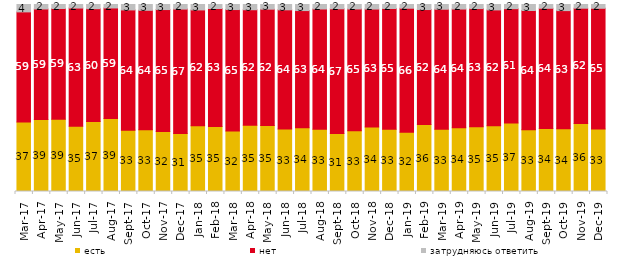
| Category | есть | нет | затрудняюсь ответить |
|---|---|---|---|
| 2017-03-01 | 37.2 | 58.85 | 3.95 |
| 2017-04-01 | 38.5 | 59.1 | 2.4 |
| 2017-05-01 | 38.7 | 59.15 | 2.15 |
| 2017-06-01 | 34.95 | 63.15 | 1.9 |
| 2017-07-01 | 37.4 | 60.35 | 2.25 |
| 2017-08-01 | 39 | 59.15 | 1.85 |
| 2017-09-01 | 32.8 | 64.3 | 2.9 |
| 2017-10-01 | 33 | 63.9 | 3.1 |
| 2017-11-01 | 32.1 | 65.15 | 2.7 |
| 2017-12-01 | 30.95 | 66.6 | 2.45 |
| 2018-01-01 | 35.2 | 61.9 | 2.9 |
| 2018-02-01 | 34.8 | 63.05 | 2.15 |
| 2018-03-01 | 32.35 | 64.95 | 2.7 |
| 2018-04-01 | 35.45 | 61.75 | 2.8 |
| 2018-05-01 | 35.3 | 62.15 | 2.5 |
| 2018-06-01 | 33.45 | 63.7 | 2.85 |
| 2018-07-01 | 34.05 | 62.7 | 3.25 |
| 2018-08-01 | 33.3 | 64.3 | 2.4 |
| 2018-09-01 | 31 | 66.7 | 2.3 |
| 2018-10-01 | 32.55 | 65.05 | 2.4 |
| 2018-11-01 | 34.431 | 63.124 | 2.445 |
| 2018-12-01 | 33.25 | 64.6 | 2.15 |
| 2019-01-01 | 31.75 | 66.25 | 2 |
| 2019-02-01 | 35.8 | 61.5 | 2.7 |
| 2019-03-01 | 33.317 | 64.147 | 2.536 |
| 2019-04-01 | 34.059 | 63.515 | 2.426 |
| 2019-05-01 | 34.621 | 63.2 | 2.179 |
| 2019-06-01 | 35.162 | 61.945 | 2.893 |
| 2019-07-01 | 36.634 | 61.139 | 2.228 |
| 2019-08-01 | 33.067 | 63.736 | 3.197 |
| 2019-09-01 | 33.713 | 64.257 | 2.03 |
| 2019-10-01 | 33.564 | 63.168 | 3.267 |
| 2019-11-01 | 36.337 | 61.683 | 1.98 |
| 2019-12-01 | 33.416 | 64.554 | 2.03 |